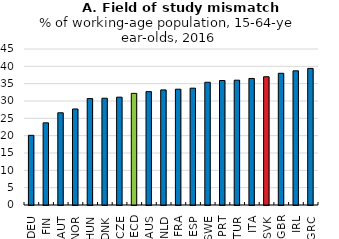
| Category | 2016 |
|---|---|
| DEU | 20.1 |
| FIN | 23.7 |
| AUT | 26.6 |
| NOR | 27.7 |
| HUN | 30.7 |
| DNK | 30.8 |
| CZE | 31.1 |
| OECD | 32.2 |
| AUS | 32.7 |
| NLD | 33.2 |
| FRA | 33.4 |
| ESP | 33.7 |
| SWE | 35.4 |
| PRT | 35.9 |
| TUR | 36 |
| ITA | 36.5 |
| SVK | 37 |
| GBR | 38 |
| IRL | 38.7 |
| GRC | 39.4 |